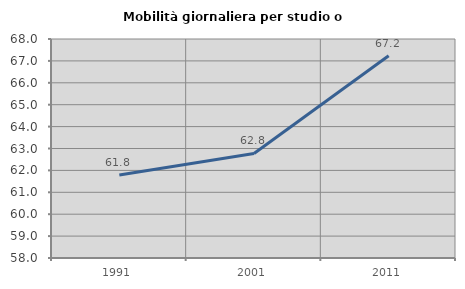
| Category | Mobilità giornaliera per studio o lavoro |
|---|---|
| 1991.0 | 61.79 |
| 2001.0 | 62.773 |
| 2011.0 | 67.237 |